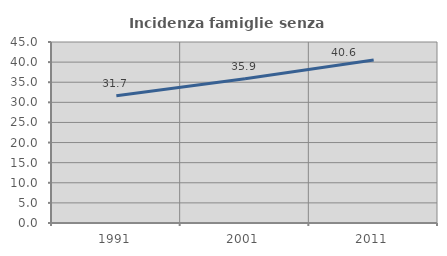
| Category | Incidenza famiglie senza nuclei |
|---|---|
| 1991.0 | 31.66 |
| 2001.0 | 35.888 |
| 2011.0 | 40.55 |